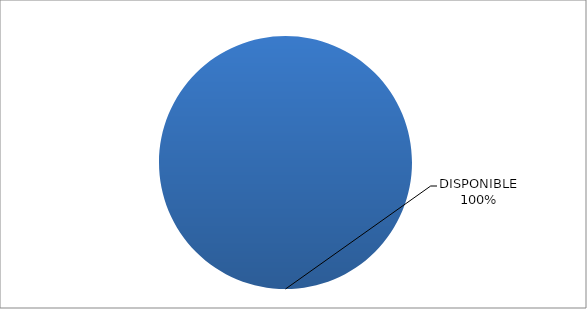
| Category | CÓDIGO DE RED 94 |
|---|---|
| DISPONIBLE | 1 |